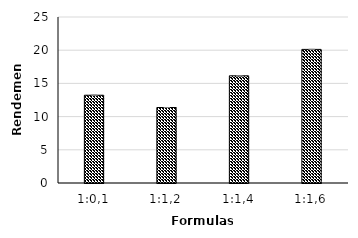
| Category | Rendemen (%) |
|---|---|
| 1:0,1 | 13.22 |
| 1:1,2 | 11.37 |
| 1:1,4 | 16.14 |
| 1:1,6 | 20.12 |